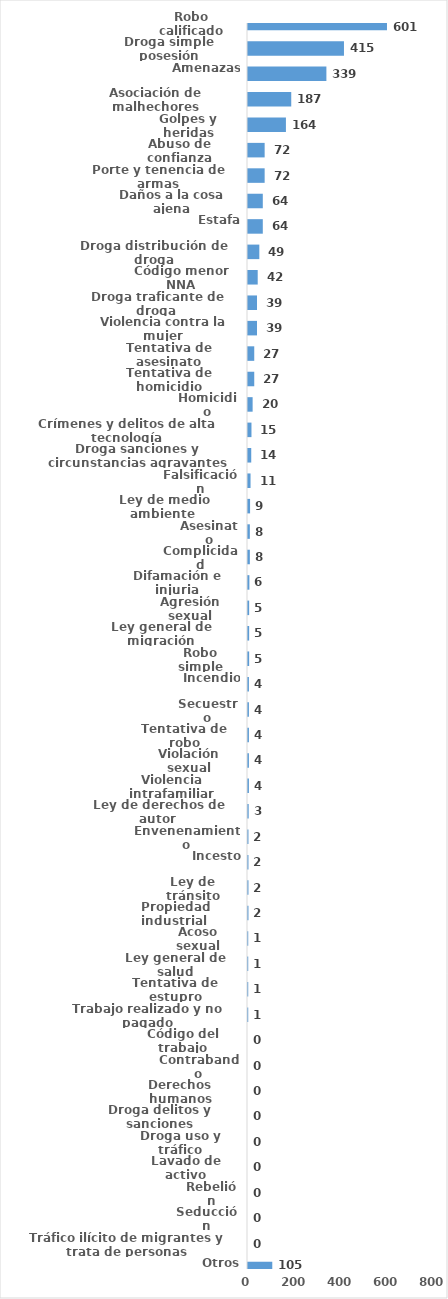
| Category | Series 0 |
|---|---|
| Robo calificado | 601 |
| Droga simple posesión | 415 |
| Amenazas | 339 |
| Asociación de malhechores | 187 |
| Golpes y heridas | 164 |
| Abuso de confianza | 72 |
| Porte y tenencia de armas | 72 |
| Daños a la cosa ajena | 64 |
| Estafa | 64 |
| Droga distribución de droga | 49 |
| Código menor NNA | 42 |
| Droga traficante de droga  | 39 |
| Violencia contra la mujer | 39 |
| Tentativa de asesinato | 27 |
| Tentativa de homicidio | 27 |
| Homicidio | 20 |
| Crímenes y delitos de alta tecnología | 15 |
| Droga sanciones y circunstancias agravantes | 14 |
| Falsificación | 11 |
| Ley de medio ambiente  | 9 |
| Asesinato | 8 |
| Complicidad | 8 |
| Difamación e injuria | 6 |
| Agresión sexual | 5 |
| Ley general de migración | 5 |
| Robo simple | 5 |
| Incendio | 4 |
| Secuestro | 4 |
| Tentativa de robo | 4 |
| Violación sexual | 4 |
| Violencia intrafamiliar | 4 |
| Ley de derechos de autor  | 3 |
| Envenenamiento | 2 |
| Incesto | 2 |
| Ley de tránsito | 2 |
| Propiedad industrial  | 2 |
| Acoso sexual | 1 |
| Ley general de salud | 1 |
| Tentativa de estupro | 1 |
| Trabajo realizado y no pagado | 1 |
| Código del trabajo | 0 |
| Contrabando | 0 |
| Derechos humanos | 0 |
| Droga delitos y sanciones | 0 |
| Droga uso y tráfico | 0 |
| Lavado de activo | 0 |
| Rebelión | 0 |
| Seducción | 0 |
| Tráfico ilícito de migrantes y trata de personas | 0 |
| Otros | 105 |